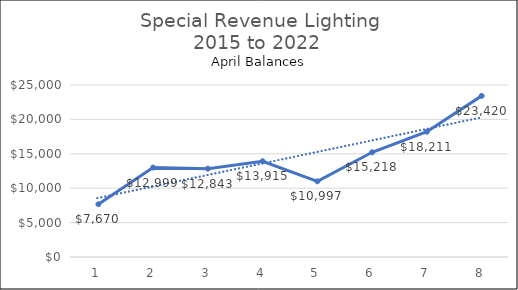
| Category | Lighting |
|---|---|
| 0 | 7670 |
| 1 | 12999.2 |
| 2 | 12842.53 |
| 3 | 13914.92 |
| 4 | 10996.87 |
| 5 | 15218.27 |
| 6 | 18210.93 |
| 7 | 23419.63 |